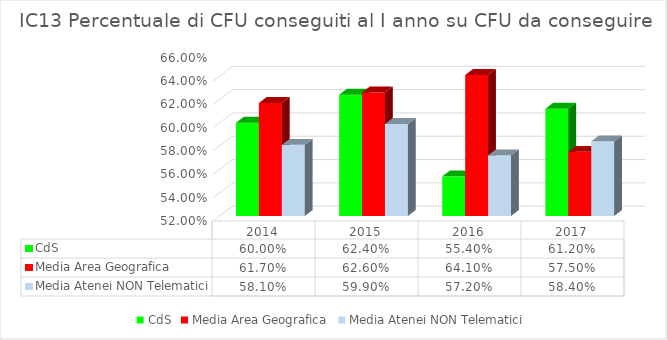
| Category | CdS | Media Area Geografica | Media Atenei NON Telematici |
|---|---|---|---|
| 2014.0 | 0.6 | 0.617 | 0.581 |
| 2015.0 | 0.624 | 0.626 | 0.599 |
| 2016.0 | 0.554 | 0.641 | 0.572 |
| 2017.0 | 0.612 | 0.575 | 0.584 |